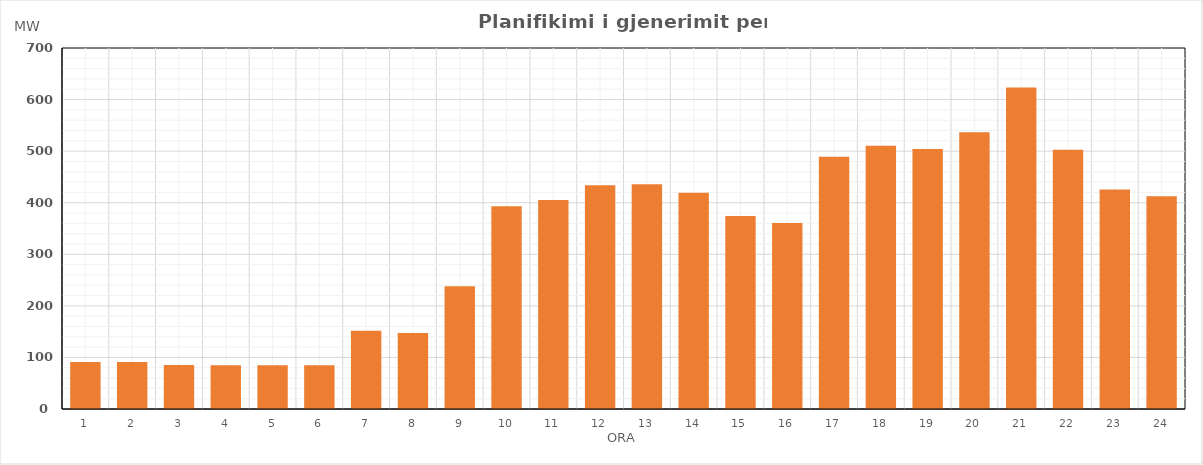
| Category | Max (MW) |
|---|---|
| 0 | 91.317 |
| 1 | 90.932 |
| 2 | 85.546 |
| 3 | 84.902 |
| 4 | 84.676 |
| 5 | 84.848 |
| 6 | 151.652 |
| 7 | 147.542 |
| 8 | 238.204 |
| 9 | 393.342 |
| 10 | 405.166 |
| 11 | 434.024 |
| 12 | 435.747 |
| 13 | 419.258 |
| 14 | 374.246 |
| 15 | 360.633 |
| 16 | 489.196 |
| 17 | 510.651 |
| 18 | 504.096 |
| 19 | 536.698 |
| 20 | 623.641 |
| 21 | 502.809 |
| 22 | 425.805 |
| 23 | 412.772 |